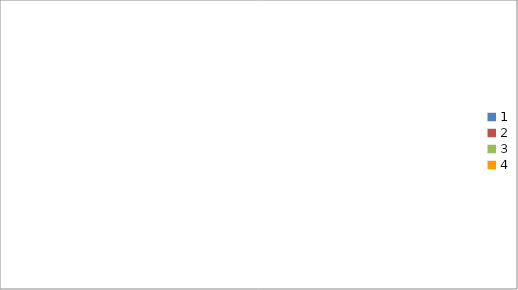
| Category | Series 0 |
|---|---|
| 0 | 1740 |
| 1 | 2500 |
| 2 | 2190 |
| 3 | 3050 |